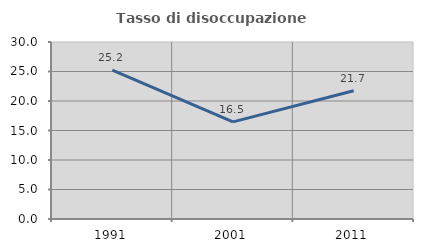
| Category | Tasso di disoccupazione giovanile  |
|---|---|
| 1991.0 | 25.248 |
| 2001.0 | 16.468 |
| 2011.0 | 21.729 |